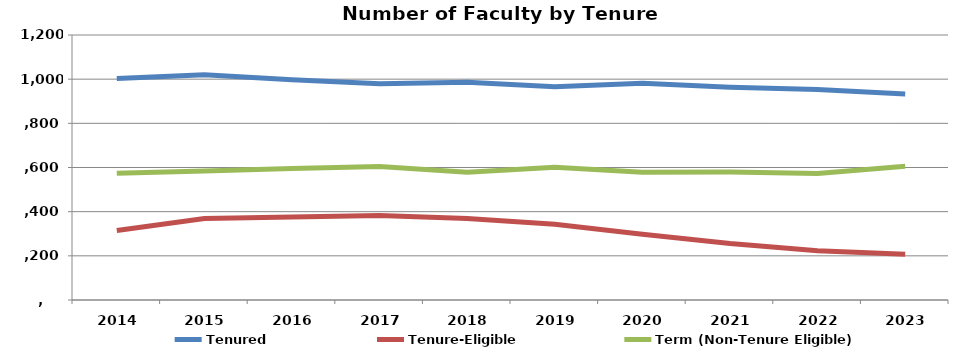
| Category | Tenured | Tenure-Eligible | Term (Non-Tenure Eligible) |
|---|---|---|---|
| 2014.0 | 1003 | 315 | 574 |
| 2015.0 | 1020 | 369 | 584 |
| 2016.0 | 997 | 376 | 596 |
| 2017.0 | 979 | 383 | 604 |
| 2018.0 | 986 | 369 | 578 |
| 2019.0 | 966 | 343 | 601 |
| 2020.0 | 981 | 298 | 579 |
| 2021.0 | 963 | 256 | 580 |
| 2022.0 | 953 | 223 | 573 |
| 2023.0 | 933 | 207 | 606 |